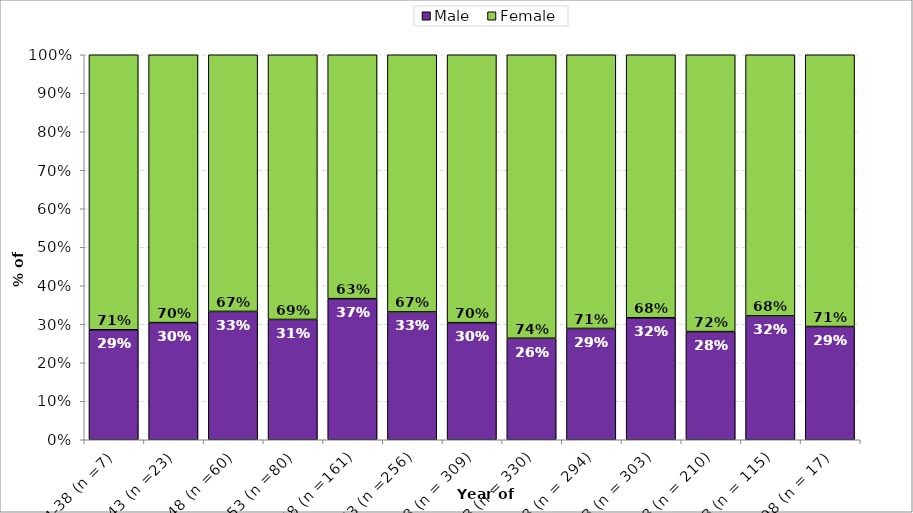
| Category | Male | Female |
|---|---|---|
| 1934-38 (n =7) | 0.286 | 0.714 |
| 1939-43 (n =23) | 0.304 | 0.696 |
| 1944-48 (n =60) | 0.333 | 0.667 |
| 1949-53 (n =80) | 0.312 | 0.688 |
| 1954-58 (n =161) | 0.366 | 0.634 |
| 1959-63 (n =256) | 0.332 | 0.668 |
| 1964-68 (n = 309) | 0.304 | 0.696 |
| 1969-73 (n = 330) | 0.264 | 0.736 |
| 1974-78 (n = 294) | 0.289 | 0.711 |
| 1979-83 (n = 303) | 0.317 | 0.683 |
| 1984-88 (n = 210) | 0.281 | 0.719 |
| 1989-93 (n = 115) | 0.322 | 0.678 |
| 1994-98 (n = 17) | 0.294 | 0.706 |